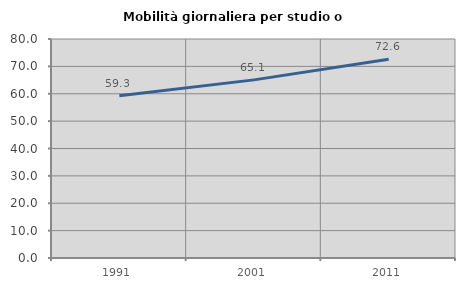
| Category | Mobilità giornaliera per studio o lavoro |
|---|---|
| 1991.0 | 59.302 |
| 2001.0 | 65.07 |
| 2011.0 | 72.588 |